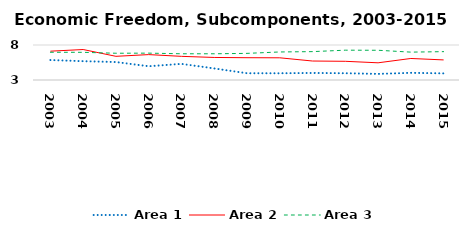
| Category | Area 1 | Area 2 | Area 3 |
|---|---|---|---|
| 2003.0 | 5.852 | 7.117 | 6.962 |
| 2004.0 | 5.688 | 7.354 | 6.954 |
| 2005.0 | 5.568 | 6.384 | 6.822 |
| 2006.0 | 4.965 | 6.629 | 6.838 |
| 2007.0 | 5.305 | 6.379 | 6.746 |
| 2008.0 | 4.652 | 6.22 | 6.746 |
| 2009.0 | 3.966 | 6.184 | 6.804 |
| 2010.0 | 3.962 | 6.171 | 7.005 |
| 2011.0 | 4.007 | 5.71 | 7.054 |
| 2012.0 | 3.966 | 5.671 | 7.259 |
| 2013.0 | 3.87 | 5.458 | 7.247 |
| 2014.0 | 4.026 | 6.074 | 6.981 |
| 2015.0 | 3.948 | 5.87 | 7.051 |